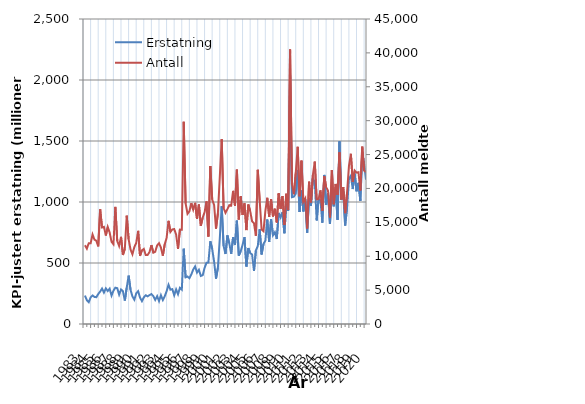
| Category | Erstatning |
|---|---|
| 1983.0 | 232.937 |
| nan | 195.121 |
| nan | 178.438 |
| nan | 218.579 |
| 1984.0 | 234.389 |
| nan | 221.715 |
| nan | 219.826 |
| nan | 245.877 |
| 1985.0 | 265.702 |
| nan | 290.42 |
| nan | 257.346 |
| nan | 291.865 |
| 1986.0 | 270.604 |
| nan | 289.558 |
| nan | 233.055 |
| nan | 272.728 |
| 1987.0 | 297.95 |
| nan | 294.021 |
| nan | 240.61 |
| nan | 283.085 |
| 1988.0 | 269.44 |
| nan | 192.069 |
| nan | 299.153 |
| nan | 396.293 |
| 1989.0 | 279.972 |
| nan | 226.285 |
| nan | 199.112 |
| nan | 251.201 |
| 1990.0 | 268.971 |
| nan | 216.388 |
| nan | 187.666 |
| nan | 218.436 |
| 1991.0 | 235.713 |
| nan | 226.637 |
| nan | 237.191 |
| nan | 245.226 |
| 1992.0 | 229.086 |
| nan | 197.393 |
| nan | 228.083 |
| nan | 188.213 |
| 1993.0 | 236.156 |
| nan | 196.535 |
| nan | 227.061 |
| nan | 268.62 |
| 1994.0 | 321.731 |
| nan | 281.266 |
| nan | 285.763 |
| nan | 235.54 |
| 1995.0 | 283.776 |
| nan | 244.132 |
| nan | 296.645 |
| nan | 281.65 |
| 1996.0 | 617.657 |
| nan | 382.464 |
| nan | 389.296 |
| nan | 375.446 |
| 1997.0 | 406.453 |
| nan | 446.013 |
| nan | 472.333 |
| nan | 421.43 |
| 1998.0 | 444.599 |
| nan | 393.872 |
| nan | 400.307 |
| nan | 460.108 |
| 1999.0 | 501.845 |
| nan | 504.283 |
| nan | 678.577 |
| nan | 614.541 |
| 2000.0 | 512.261 |
| nan | 372.014 |
| nan | 461.192 |
| nan | 703.176 |
| 2001.0 | 965.028 |
| nan | 638.852 |
| nan | 573.774 |
| nan | 725.942 |
| 2002.0 | 661.156 |
| nan | 575.27 |
| nan | 710.935 |
| nan | 647.82 |
| 2003.0 | 847.26 |
| nan | 560.178 |
| nan | 595.958 |
| nan | 649.208 |
| 2004.0 | 712.217 |
| nan | 470.87 |
| nan | 622.509 |
| nan | 581.854 |
| 2005.0 | 569.493 |
| nan | 434.602 |
| nan | 603.345 |
| nan | 639.394 |
| 2006.0 | 777.195 |
| nan | 569.965 |
| nan | 655.815 |
| nan | 684.196 |
| 2007.0 | 856.408 |
| nan | 673.317 |
| nan | 860.276 |
| nan | 727.347 |
| 2008.0 | 752.172 |
| nan | 696.322 |
| nan | 909.437 |
| nan | 873.42 |
| 2009.0 | 916.557 |
| nan | 744.098 |
| nan | 982.934 |
| nan | 929.078 |
| 2010.0 | 2038.021 |
| nan | 1039.492 |
| nan | 1044.493 |
| nan | 1068.56 |
| 2011.0 | 1262.842 |
| nan | 918.31 |
| nan | 1094.943 |
| nan | 922.779 |
| 2012.0 | 1022.313 |
| nan | 747.404 |
| nan | 1030.461 |
| nan | 970.277 |
| 2013.0 | 1191.601 |
| nan | 1166.802 |
| nan | 849.019 |
| nan | 1025.516 |
| 2014.0 | 1011.435 |
| nan | 830.588 |
| nan | 1221.838 |
| nan | 976.933 |
| 2015.0 | 1071.822 |
| nan | 820.828 |
| nan | 1086.542 |
| nan | 964.725 |
| 2016.0 | 1109.027 |
| nan | 853.659 |
| nan | 1497.167 |
| nan | 1015.828 |
| 2017.0 | 1088.954 |
| nan | 807.65 |
| nan | 953.843 |
| nan | 1191.034 |
| 2018.0 | 1215.874 |
| nan | 1106.121 |
| nan | 1232.942 |
| nan | 1087.816 |
| 2019.0 | 1157.146 |
| nan | 1008.947 |
| nan | 1404.229 |
| nan | 1307.73 |
| 2020.0 | 1182.332 |